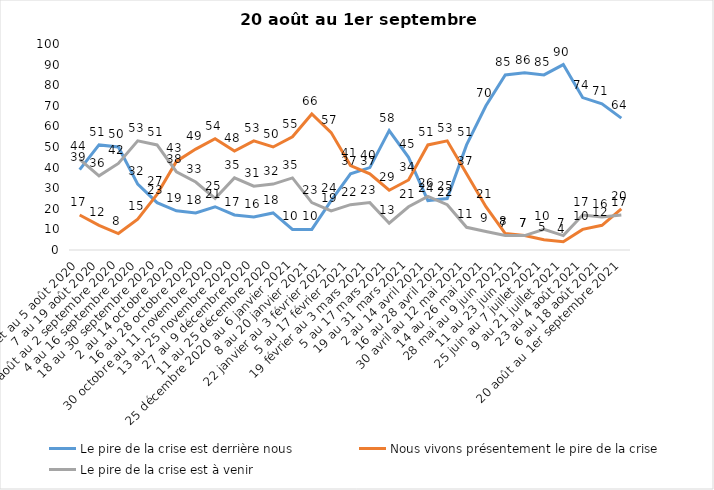
| Category | Le pire de la crise est derrière nous | Nous vivons présentement le pire de la crise | Le pire de la crise est à venir |
|---|---|---|---|
| 24 juillet au 5 août 2020 | 39 | 17 | 44 |
| 7 au 19 août 2020 | 51 | 12 | 36 |
| 21 août au 2 septembre 2020 | 50 | 8 | 42 |
| 4 au 16 septembre 2020 | 32 | 15 | 53 |
| 18 au 30 septembre 2020 | 23 | 27 | 51 |
| 2 au 14 octobre 2020 | 19 | 43 | 38 |
| 16 au 28 octobre 2020 | 18 | 49 | 33 |
| 30 octobre au 11 novembre 2020 | 21 | 54 | 25 |
| 13 au 25 novembre 2020 | 17 | 48 | 35 |
| 27 au 9 décembre 2020 | 16 | 53 | 31 |
| 11 au 25 décembre 2020 | 18 | 50 | 32 |
| 25 décembre 2020 au 6 janvier 2021 | 10 | 55 | 35 |
| 8 au 20 janvier 2021 | 10 | 66 | 23 |
| 22 janvier au 3 février 2021 | 24 | 57 | 19 |
| 5 au 17 février 2021 | 37 | 41 | 22 |
| 19 février au 3 mars 2021 | 40 | 37 | 23 |
| 5 au 17 mars 2021 | 58 | 29 | 13 |
| 19 au 31 mars 2021 | 45 | 34 | 21 |
| 2 au 14 avril 2021 | 24 | 51 | 26 |
| 16 au 28 avril 2021 | 25 | 53 | 22 |
| 30 avril au 12 mai 2021 | 51 | 37 | 11 |
| 14 au 26 mai 2021 | 70 | 21 | 9 |
| 28 mai au 9 juin 2021 | 85 | 8 | 7 |
| 11 au 23 juin 2021 | 86 | 7 | 7 |
| 25 juin au 7 juillet 2021 | 85 | 5 | 10 |
| 9 au 21 juillet 2021 | 90 | 4 | 7 |
| 23 au 4 août 2021 | 74 | 10 | 17 |
| 6 au 18 août 2021 | 71 | 12 | 16 |
| 20 août au 1er septembre 2021 | 64 | 20 | 17 |